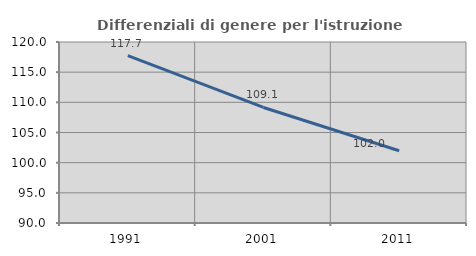
| Category | Differenziali di genere per l'istruzione superiore |
|---|---|
| 1991.0 | 117.733 |
| 2001.0 | 109.149 |
| 2011.0 | 101.973 |